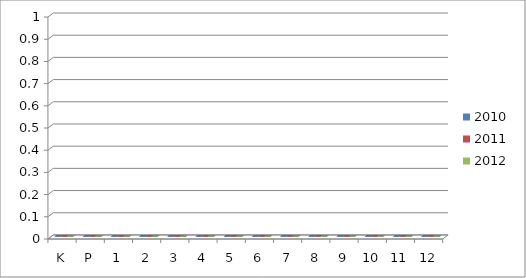
| Category | 2010 | 2011 | 2012 |
|---|---|---|---|
| K | 0 | 0 | 0 |
| P | 0 | 0 | 0 |
| 1 | 0 | 0 | 0 |
| 2 | 0 | 0 | 0 |
| 3 | 0 | 0 | 0 |
| 4 | 0 | 0 | 0 |
| 5 | 0 | 0 | 0 |
| 6 | 0 | 0 | 0 |
| 7 | 0 | 0 | 0 |
| 8 | 0 | 0 | 0 |
| 9 | 0 | 0 | 0 |
| 10 | 0 | 0 | 0 |
| 11 | 0 | 0 | 0 |
| 12 | 0 | 0 | 0 |